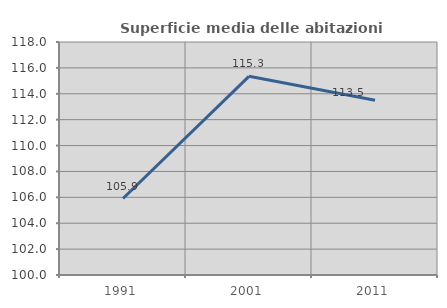
| Category | Superficie media delle abitazioni occupate |
|---|---|
| 1991.0 | 105.909 |
| 2001.0 | 115.349 |
| 2011.0 | 113.5 |